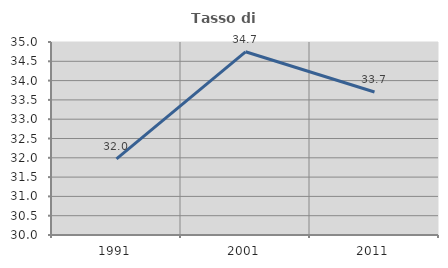
| Category | Tasso di occupazione   |
|---|---|
| 1991.0 | 31.971 |
| 2001.0 | 34.747 |
| 2011.0 | 33.706 |